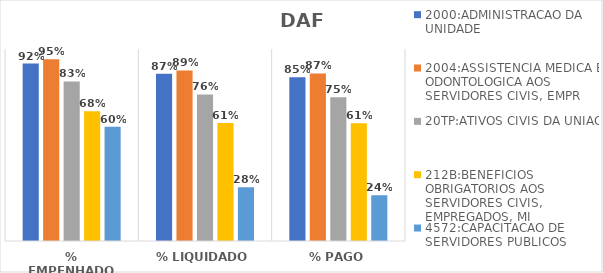
| Category | 2000:ADMINISTRACAO DA UNIDADE | 2004:ASSISTENCIA MEDICA E ODONTOLOGICA AOS SERVIDORES CIVIS, EMPR | 20TP:ATIVOS CIVIS DA UNIAO | 212B:BENEFICIOS OBRIGATORIOS AOS SERVIDORES CIVIS, EMPREGADOS, MI | 4572:CAPACITACAO DE SERVIDORES PUBLICOS FEDERAIS EM PROCESSO DE Q |
|---|---|---|---|---|---|
| % EMPENHADO | 0.924 | 0.947 | 0.831 | 0.675 | 0.595 |
| % LIQUIDADO | 0.871 | 0.888 | 0.764 | 0.614 | 0.28 |
| % PAGO | 0.852 | 0.873 | 0.749 | 0.613 | 0.238 |